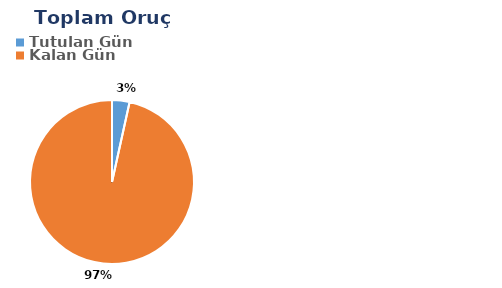
| Category | Toplam |
|---|---|
| Tutulan Gün | 1 |
| Kalan Gün | 28 |